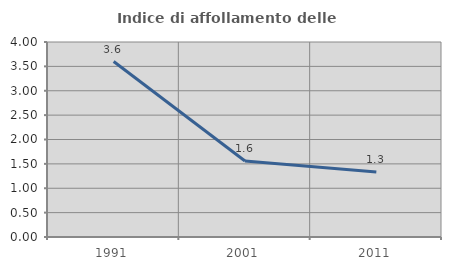
| Category | Indice di affollamento delle abitazioni  |
|---|---|
| 1991.0 | 3.6 |
| 2001.0 | 1.559 |
| 2011.0 | 1.336 |